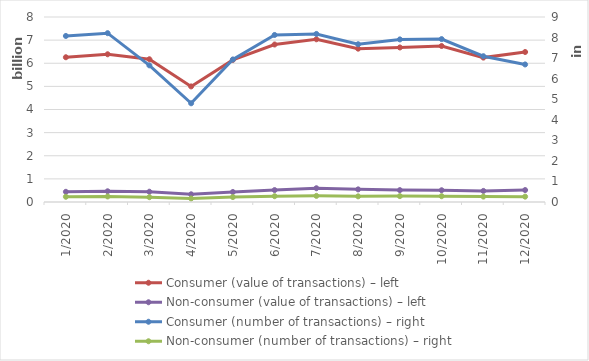
| Category | Consumer (value of transactions) – left | Non-consumer (value of transactions) – left |
|---|---|---|
| 1/2020 | 6259548798 | 440348430 |
| 2/2020 | 6388256454 | 463676080 |
| 3/2020 | 6172725100 | 445095762 |
| 4/2020 | 4998021226 | 332920558 |
| 5/2020 | 6146022505 | 432251910 |
| 6/2020 | 6810557937 | 515453705 |
| 7/2020 | 7036618457 | 594979871 |
| 8/2020 | 6630406431 | 546084550 |
| 9/2020 | 6682054825 | 513931054 |
| 10/2020 | 6745138538 | 508111417 |
| 11/2020 | 6244269911 | 479277559 |
| 12/2020 | 6486364263 | 516710755 |